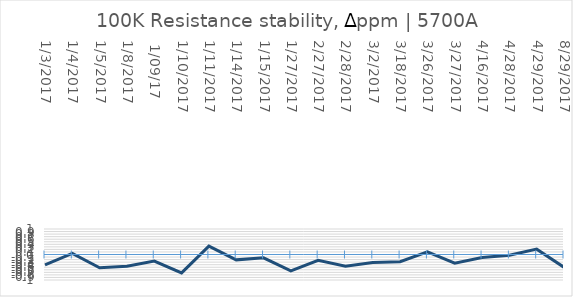
| Category | Series 0 |
|---|---|
| 1/3/2017 | -0.41 |
| 1/4/2017 | 0.04 |
| 1/5/2017 | -0.52 |
| 1/8/2017 | -0.46 |
|  1/09/17 | -0.26 |
| 1/10/2017 | -0.72 |
| 1/11/2017 | 0.33 |
| 1/14/2017 | -0.21 |
| 1/15/2017 | -0.13 |
| 1/27/2017 | -0.64 |
| 2/27/2017 | -0.23 |
| 2/28/2017 | -0.46 |
| 3/2/2017 | -0.31 |
| 3/18/2017 | -0.28 |
| 3/26/2017 | 0.1 |
| 3/27/2017 | -0.34 |
| 4/16/2017 | -0.12 |
| 4/28/2017 | -0.03 |
| 4/29/2017 | 0.21 |
| 8/29/2017 | -0.5 |